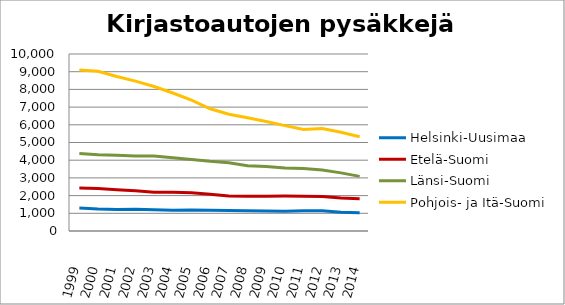
| Category | Helsinki-Uusimaa | Etelä-Suomi | Länsi-Suomi | Pohjois- ja Itä-Suomi |
|---|---|---|---|---|
| 1999.0 | 1305 | 2434 | 4385 | 9094 |
| 2000.0 | 1239 | 2396 | 4303 | 9022 |
| 2001.0 | 1219 | 2337 | 4275 | 8733 |
| 2002.0 | 1231 | 2273 | 4243 | 8469 |
| 2003.0 | 1207 | 2193 | 4243 | 8164 |
| 2004.0 | 1175 | 2185 | 4144 | 7798 |
| 2005.0 | 1188 | 2158 | 4043 | 7398 |
| 2006.0 | 1174 | 2074 | 3938 | 6907 |
| 2007.0 | 1162 | 1978 | 3859 | 6599 |
| 2008.0 | 1149 | 1960 | 3686 | 6393 |
| 2009.0 | 1134 | 1962 | 3639 | 6190 |
| 2010.0 | 1121 | 1974 | 3555.5 | 5955 |
| 2011.0 | 1145 | 1963 | 3530 | 5740 |
| 2012.0 | 1140 | 1952 | 3444 | 5788 |
| 2013.0 | 1060 | 1868 | 3283 | 5576 |
| 2014.0 | 1036 | 1823 | 3086 | 5322 |